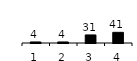
| Category | Series 0 |
|---|---|
| 1.0 | 4 |
| 2.0 | 4 |
| 3.0 | 31 |
| 4.0 | 41 |